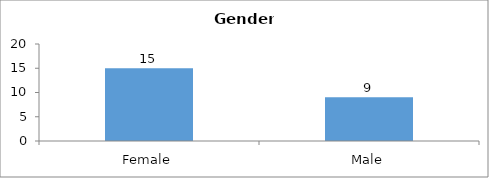
| Category | Gender |
|---|---|
| Female | 15 |
| Male | 9 |